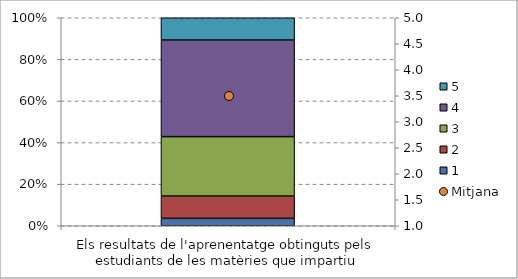
| Category | 1 | 2 | 3 | 4 | 5 |
|---|---|---|---|---|---|
| Els resultats de l'aprenentatge obtinguts pels estudiants de les matèries que impartiu | 0.036 | 0.107 | 0.286 | 0.464 | 0.107 |